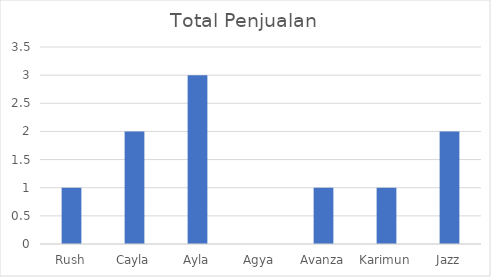
| Category | Total Penjualan |
|---|---|
| Rush | 1 |
| Cayla | 2 |
| Ayla | 3 |
| Agya | 0 |
| Avanza | 1 |
| Karimun | 1 |
| Jazz | 2 |